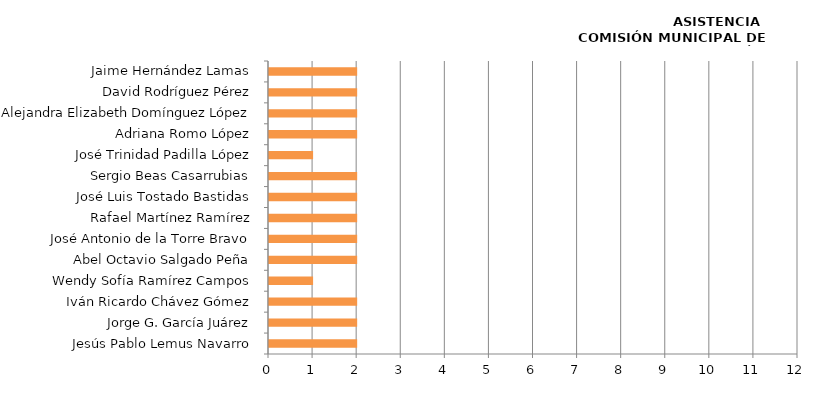
| Category | Series 0 |
|---|---|
| Jesús Pablo Lemus Navarro | 2 |
| Jorge G. García Juárez | 2 |
| Iván Ricardo Chávez Gómez | 2 |
| Wendy Sofía Ramírez Campos | 1 |
| Abel Octavio Salgado Peña | 2 |
| José Antonio de la Torre Bravo | 2 |
| Rafael Martínez Ramírez | 2 |
| José Luis Tostado Bastidas | 2 |
| Sergio Beas Casarrubias | 2 |
| José Trinidad Padilla López | 1 |
| Adriana Romo López | 2 |
| Alejandra Elizabeth Domínguez López | 2 |
| David Rodríguez Pérez | 2 |
| Jaime Hernández Lamas | 2 |